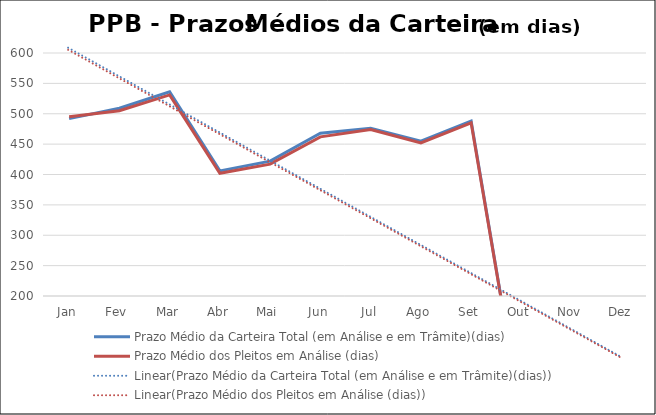
| Category | Prazo Médio da Carteira Total (em Análise e em Trâmite)(dias) | Prazo Médio dos Pleitos em Análise (dias) |
|---|---|---|
| Jan | 492 | 495 |
| Fev | 509 | 505 |
| Mar | 536 | 531 |
| Abr | 406 | 402 |
| Mai | 422 | 417 |
| Jun | 468 | 462 |
| Jul | 476 | 474 |
| Ago | 455 | 452 |
| Set | 488 | 485 |
| Out | 0 | 0 |
| Nov | 0 | 0 |
| Dez | 0 | 0 |